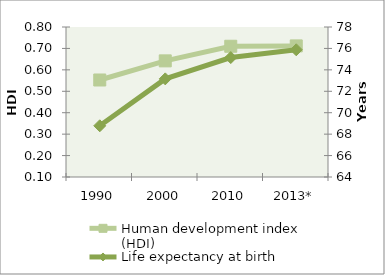
| Category | Human development index (HDI) |
|---|---|
| 1990 | 0.553 |
| 2000 | 0.642 |
| 2010 | 0.71 |
| 2013* | 0.712 |